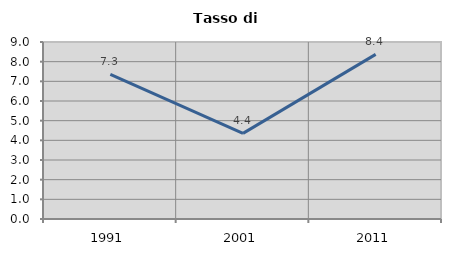
| Category | Tasso di disoccupazione   |
|---|---|
| 1991.0 | 7.35 |
| 2001.0 | 4.354 |
| 2011.0 | 8.37 |